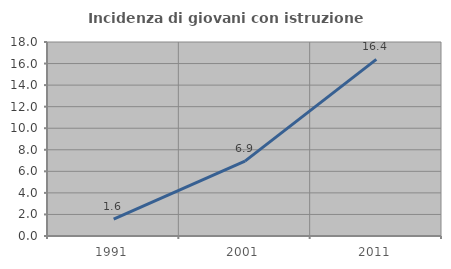
| Category | Incidenza di giovani con istruzione universitaria |
|---|---|
| 1991.0 | 1.575 |
| 2001.0 | 6.942 |
| 2011.0 | 16.39 |